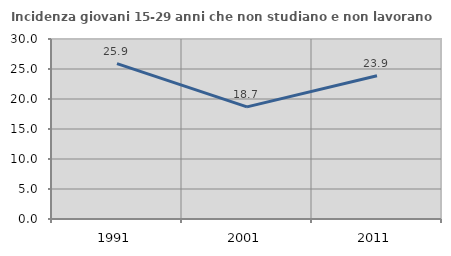
| Category | Incidenza giovani 15-29 anni che non studiano e non lavorano  |
|---|---|
| 1991.0 | 25.886 |
| 2001.0 | 18.681 |
| 2011.0 | 23.864 |